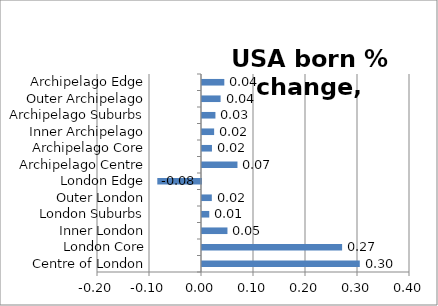
| Category | Series 0 |
|---|---|
| Centre of London | 0.303 |
| London Core | 0.269 |
| Inner London | 0.049 |
| London Suburbs | 0.014 |
| Outer London | 0.019 |
| London Edge | -0.084 |
| Archipelago Centre | 0.068 |
| Archipelago Core | 0.019 |
| Inner Archipelago | 0.023 |
| Archipelago Suburbs | 0.026 |
| Outer Archipelago | 0.036 |
| Archipelago Edge | 0.043 |